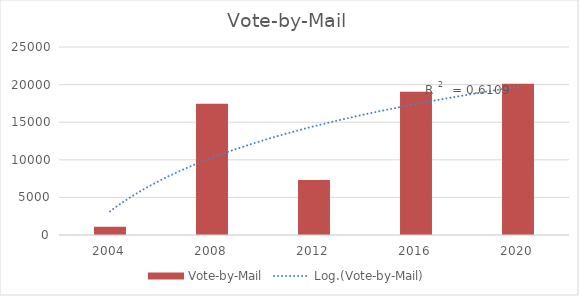
| Category | Vote-by-Mail |
|---|---|
| 2004.0 | 1096 |
| 2008.0 | 17444 |
| 2012.0 | 7321 |
| 2016.0 | 19059 |
| 2020.0 | 20098 |